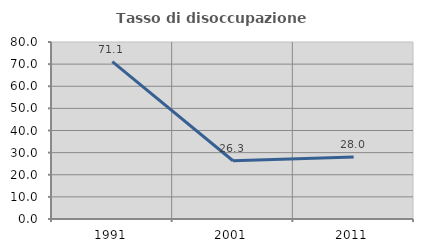
| Category | Tasso di disoccupazione giovanile  |
|---|---|
| 1991.0 | 71.111 |
| 2001.0 | 26.316 |
| 2011.0 | 28 |